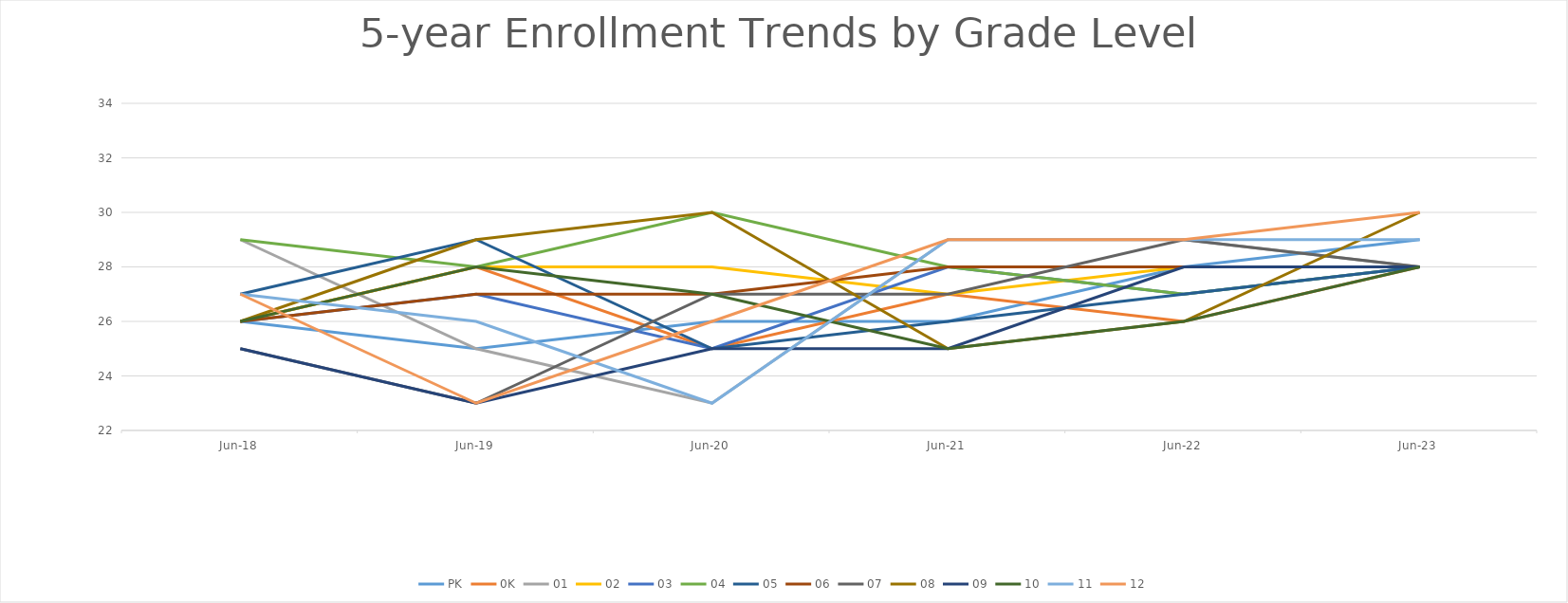
| Category | PK | 0K | 01 | 02 | 03 | 04 | 05 | 06 | 07 | 08 | 09 | 10 | 11 | 12 |
|---|---|---|---|---|---|---|---|---|---|---|---|---|---|---|
| 2018-06-01 | 26 | 26 | 29 | 26 | 26 | 29 | 27 | 26 | 25 | 26 | 25 | 26 | 27 | 27 |
| 2019-06-01 | 25 | 28 | 25 | 28 | 27 | 28 | 29 | 27 | 23 | 29 | 23 | 28 | 26 | 23 |
| 2020-06-01 | 26 | 25 | 23 | 28 | 25 | 30 | 25 | 27 | 27 | 30 | 25 | 27 | 23 | 26 |
| 2021-06-01 | 26 | 27 | 29 | 27 | 28 | 28 | 26 | 28 | 27 | 25 | 25 | 25 | 29 | 29 |
| 2022-06-01 | 28 | 26 | 29 | 28 | 27 | 27 | 27 | 28 | 29 | 26 | 28 | 26 | 29 | 29 |
| 2023-06-01 | 29 | 28 | 28 | 28 | 28 | 28 | 28 | 28 | 28 | 30 | 28 | 28 | 29 | 30 |